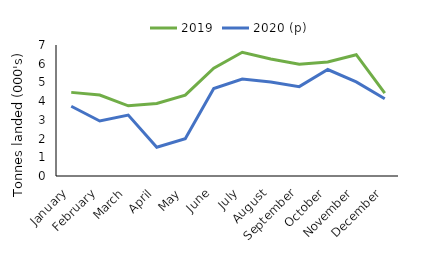
| Category | 2019 | 2020 (p) |
|---|---|---|
| January | 4.468 | 3.726 |
| February | 4.329 | 2.94 |
| March | 3.751 | 3.255 |
| April | 3.876 | 1.539 |
| May | 4.323 | 1.996 |
| June | 5.763 | 4.673 |
| July | 6.613 | 5.176 |
| August | 6.249 | 5.024 |
| September | 5.969 | 4.775 |
| October | 6.092 | 5.689 |
| November | 6.482 | 5.026 |
| December | 4.423 | 4.132 |